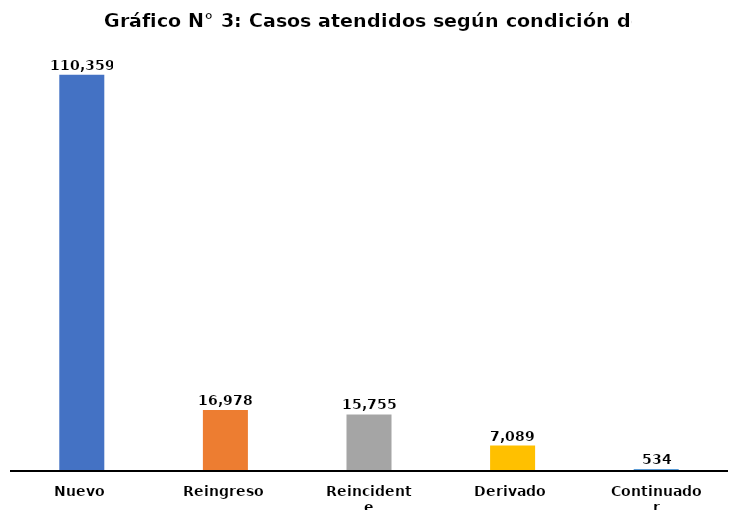
| Category | Series 0 |
|---|---|
| Nuevo | 110359 |
| Reingreso | 16978 |
| Reincidente | 15755 |
| Derivado | 7089 |
| Continuador | 534 |